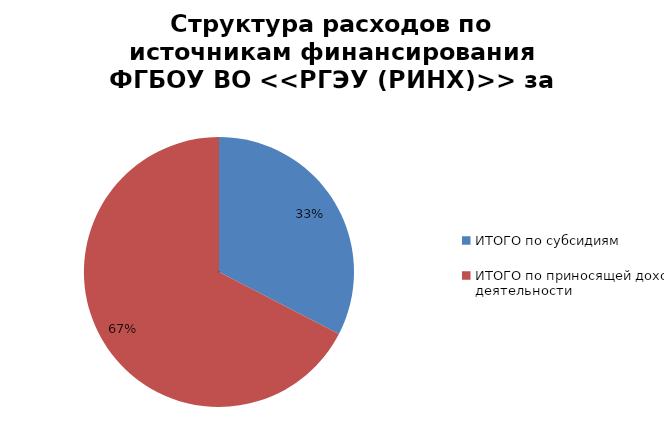
| Category | Series 0 |
|---|---|
| ИТОГО по субсидиям | 484685.2 |
| ИТОГО по приносящей доход деятельности | 1002609 |